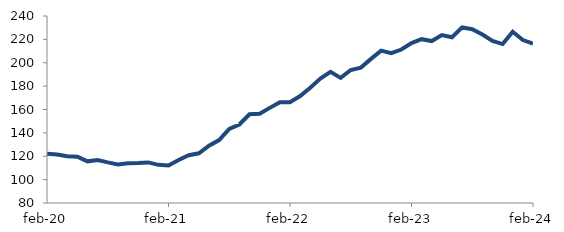
| Category | Series 0 |
|---|---|
| 2020-02-01 | 122.238 |
| 2020-03-01 | 121.406 |
| 2020-04-01 | 120.076 |
| 2020-05-01 | 119.592 |
| 2020-06-01 | 115.658 |
| 2020-07-01 | 116.729 |
| 2020-08-01 | 114.728 |
| 2020-09-01 | 113.012 |
| 2020-10-01 | 114.05 |
| 2020-11-01 | 114.24 |
| 2020-12-01 | 114.741 |
| 2021-01-01 | 112.625 |
| 2021-02-01 | 112.14 |
| 2021-03-01 | 116.74 |
| 2021-04-01 | 120.911 |
| 2021-05-01 | 122.536 |
| 2021-06-01 | 128.968 |
| 2021-07-01 | 133.864 |
| 2021-08-01 | 143.384 |
| 2021-09-01 | 147.196 |
| 2021-10-01 | 155.883 |
| 2021-11-01 | 156.426 |
| 2021-12-01 | 161.4 |
| 2022-01-01 | 166.276 |
| 2022-02-01 | 166.219 |
| 2022-03-01 | 171.531 |
| 2022-04-01 | 178.644 |
| 2022-05-01 | 186.465 |
| 2022-06-01 | 192.187 |
| 2022-07-01 | 187.044 |
| 2022-08-01 | 193.806 |
| 2022-09-01 | 195.846 |
| 2022-10-01 | 203.287 |
| 2022-11-01 | 210.344 |
| 2022-12-01 | 208.16 |
| 2023-01-01 | 211.29 |
| 2023-02-01 | 216.772 |
| 2023-03-01 | 220.156 |
| 2023-04-01 | 218.537 |
| 2023-05-01 | 223.702 |
| 2023-06-01 | 221.798 |
| 2023-07-01 | 230.236 |
| 2023-08-01 | 228.637 |
| 2023-09-01 | 224.175 |
| 2023-10-01 | 218.647 |
| 2023-11-01 | 215.985 |
| 2023-12-01 | 226.505 |
| 2024-01-01 | 219.392 |
| 2024-02-01 | 216.347 |